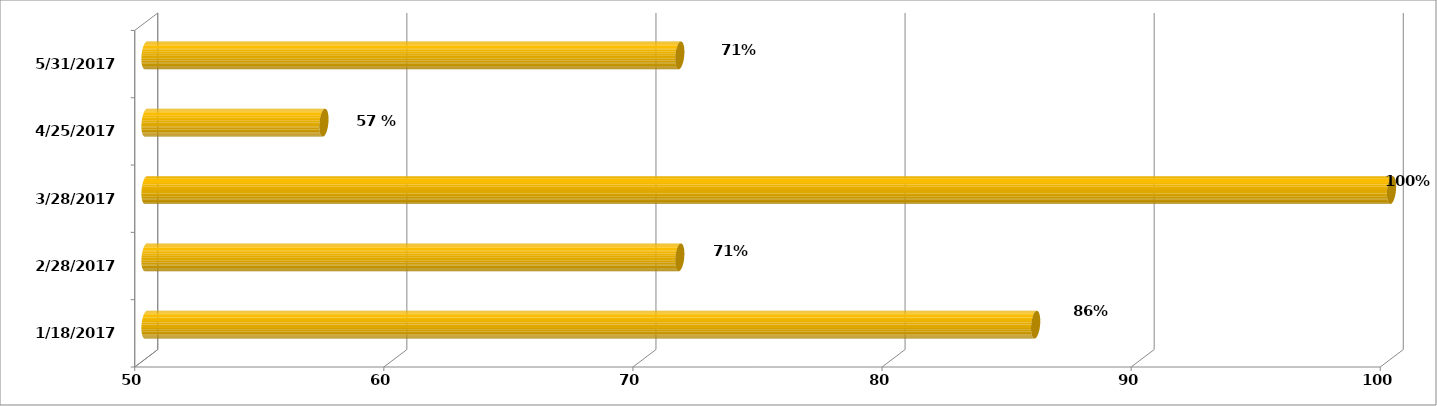
| Category | Series 0 |
|---|---|
| 18/01/2017 | 85.714 |
| 28/02/2017 | 71.429 |
| 28/03/2017 | 100 |
| 25/04/2017 | 57.143 |
| 31/05/2017 | 71.429 |